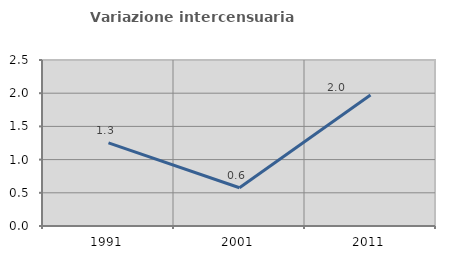
| Category | Variazione intercensuaria annua |
|---|---|
| 1991.0 | 1.253 |
| 2001.0 | 0.576 |
| 2011.0 | 1.973 |